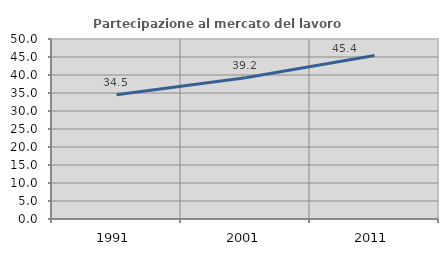
| Category | Partecipazione al mercato del lavoro  femminile |
|---|---|
| 1991.0 | 34.496 |
| 2001.0 | 39.227 |
| 2011.0 | 45.424 |